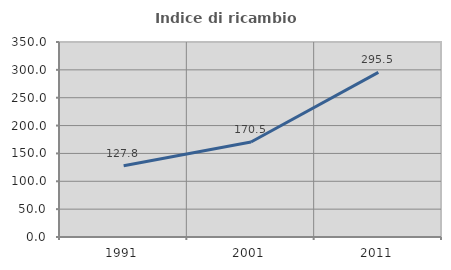
| Category | Indice di ricambio occupazionale  |
|---|---|
| 1991.0 | 127.835 |
| 2001.0 | 170.526 |
| 2011.0 | 295.455 |